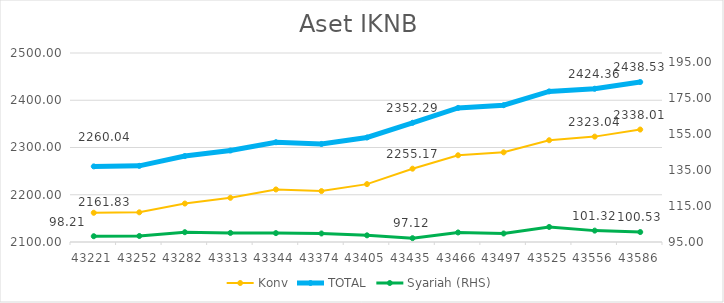
| Category | Konv | TOTAL |
|---|---|---|
| 2018-05-01 | 2161.828 | 2260.043 |
| 2018-06-01 | 2162.818 | 2261.154 |
| 2018-07-01 | 2181.39 | 2281.837 |
| 2018-08-01 | 2193.55 | 2293.599 |
| 2018-09-01 | 2211.208 | 2311.146 |
| 2018-10-01 | 2207.768 | 2307.509 |
| 2018-11-01 | 2222.478 | 2321.18 |
| 2018-12-01 | 2255.172 | 2352.287 |
| 2019-01-01 | 2283.536 | 2383.836 |
| 2019-02-01 | 2289.807 | 2389.536 |
| 2019-03-01 | 2315.383 | 2418.739 |
| 2019-04-01 | 2323.04 | 2424.36 |
| 2019-05-01 | 2338.007 | 2438.533 |